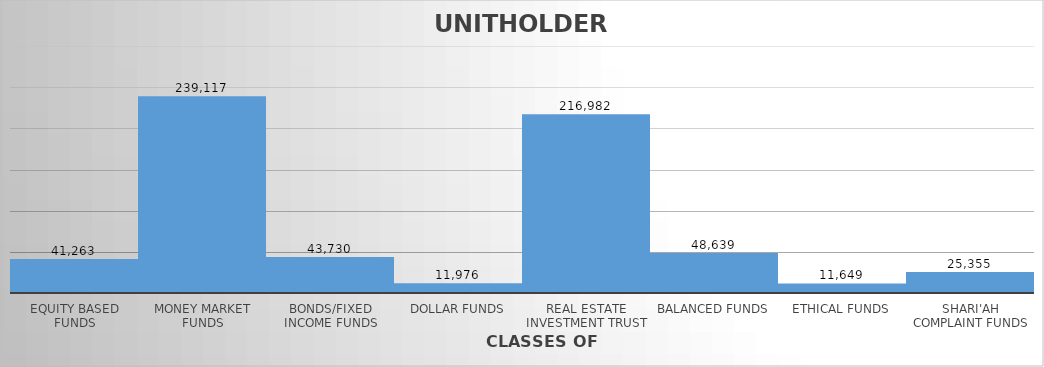
| Category | UNIT HOLDERS |
|---|---|
| EQUITY BASED FUNDS | 41263 |
| MONEY MARKET FUNDS | 239117 |
| BONDS/FIXED INCOME FUNDS | 43730 |
| DOLLAR FUNDS | 11976 |
| REAL ESTATE INVESTMENT TRUST | 216982 |
| BALANCED FUNDS | 48639 |
| ETHICAL FUNDS | 11649 |
| SHARI'AH COMPLAINT FUNDS | 25355 |